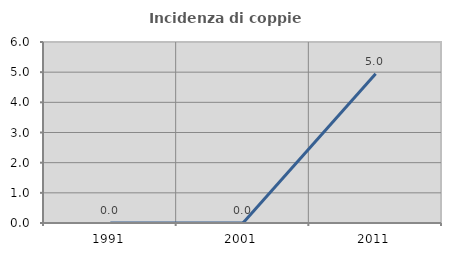
| Category | Incidenza di coppie miste |
|---|---|
| 1991.0 | 0 |
| 2001.0 | 0 |
| 2011.0 | 4.95 |